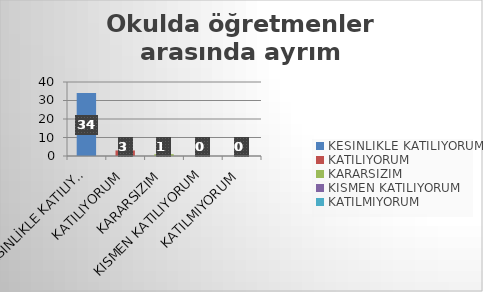
| Category | Okulda öğretmenler arasında ayrım yapılmamaktadır. |
|---|---|
| KESİNLİKLE KATILIYORUM | 34 |
| KATILIYORUM | 3 |
| KARARSIZIM | 1 |
| KISMEN KATILIYORUM | 0 |
| KATILMIYORUM | 0 |